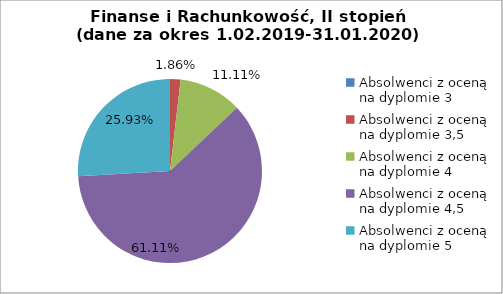
| Category | Series 0 |
|---|---|
| Absolwenci z oceną na dyplomie 3 | 0 |
| Absolwenci z oceną na dyplomie 3,5 | 1.852 |
| Absolwenci z oceną na dyplomie 4 | 11.111 |
| Absolwenci z oceną na dyplomie 4,5 | 61.111 |
| Absolwenci z oceną na dyplomie 5 | 25.926 |